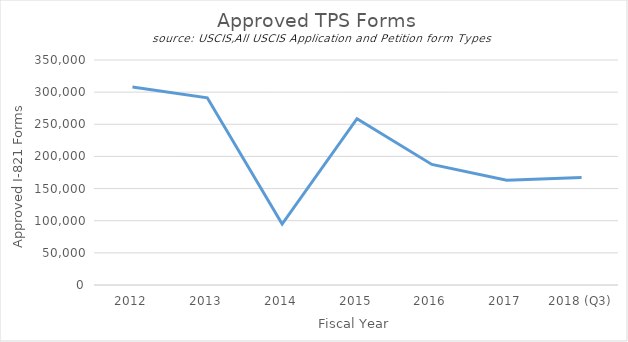
| Category | Approved TPS Forms |
|---|---|
| 2012 | 308062 |
| 2013 | 291258 |
| 2014 | 94837 |
| 2015 | 258722 |
| 2016 | 187521 |
| 2017 | 163093 |
| 2018 (Q3) | 167146 |